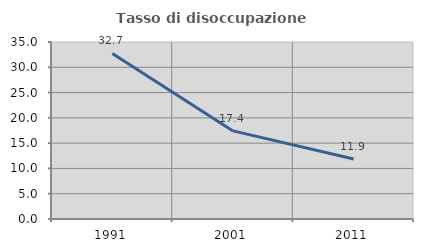
| Category | Tasso di disoccupazione giovanile  |
|---|---|
| 1991.0 | 32.746 |
| 2001.0 | 17.419 |
| 2011.0 | 11.852 |